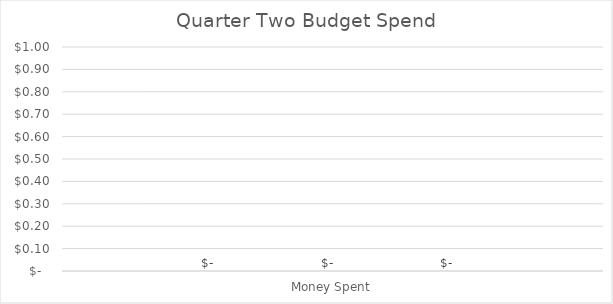
| Category | April Budget | May Budget | June Budget |
|---|---|---|---|
| 0 | 0 | 0 | 0 |